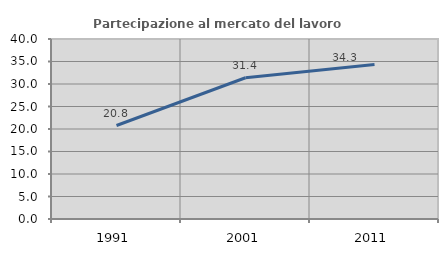
| Category | Partecipazione al mercato del lavoro  femminile |
|---|---|
| 1991.0 | 20.772 |
| 2001.0 | 31.385 |
| 2011.0 | 34.328 |